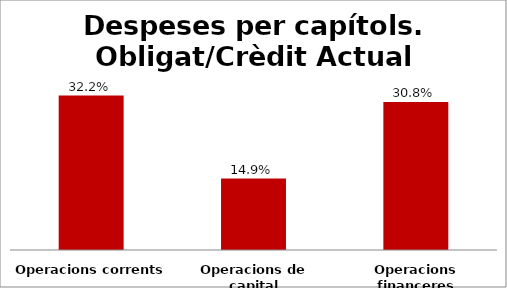
| Category | Series 0 |
|---|---|
| Operacions corrents | 0.322 |
| Operacions de capital | 0.149 |
| Operacions financeres | 0.308 |